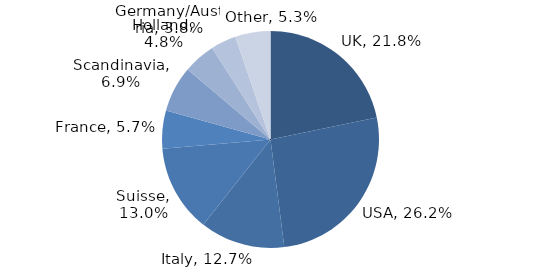
| Category | Investment Style |
|---|---|
| UK | 0.218 |
| USA | 0.262 |
| Italy | 0.127 |
| Suisse | 0.13 |
| France | 0.057 |
| Scandinavia | 0.069 |
| Holland | 0.048 |
| Germany/Austria | 0.038 |
| Other | 0.053 |